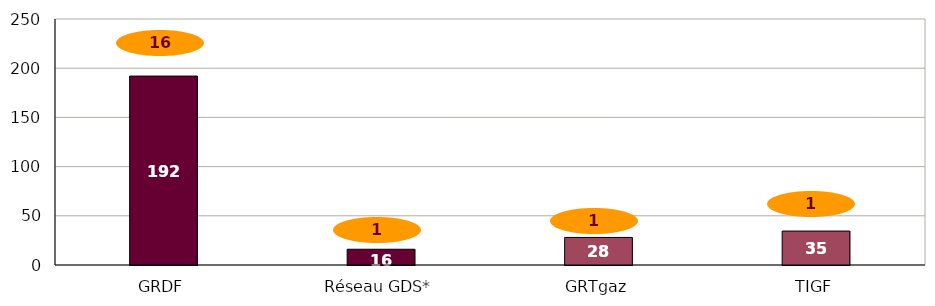
| Category | Capacité de production sur le réseau |
|---|---|
| GRDF | 192 |
| Réseau GDS* | 16 |
| GRTgaz | 28 |
| TIGF | 34.5 |